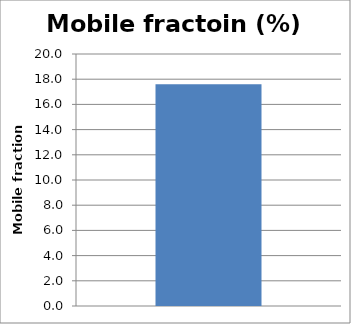
| Category | Mobile fractoin (%) |
|---|---|
| 0 | 17.608 |